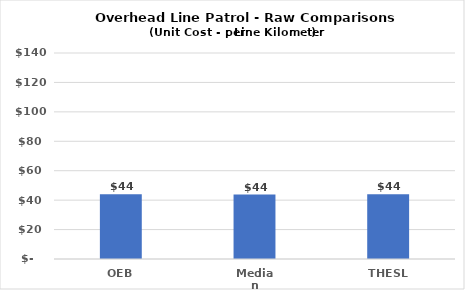
| Category | Series 0 |
|---|---|
| OEB | 44 |
| Median | 43.81 |
| THESL | 44 |